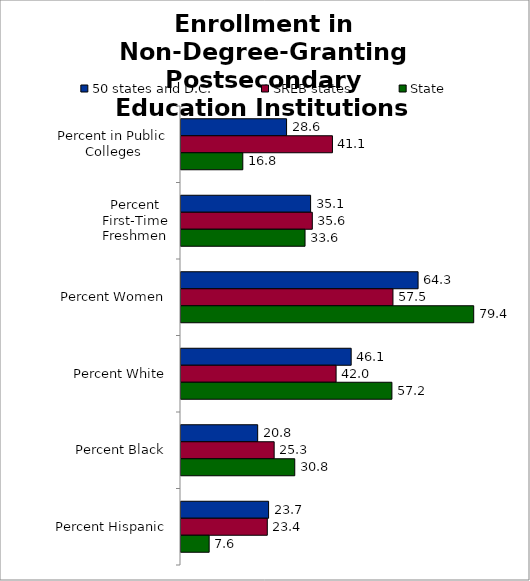
| Category | 50 states and D.C. | SREB states | State |
|---|---|---|---|
| 0 | 28.619 | 41.053 | 16.756 |
| 1 | 35.133 | 35.599 | 33.626 |
| 2 | 64.268 | 57.458 | 79.351 |
| 3 | 46.134 | 42.047 | 57.176 |
| 4 | 20.789 | 25.257 | 30.84 |
| 5 | 23.744 | 23.397 | 7.634 |